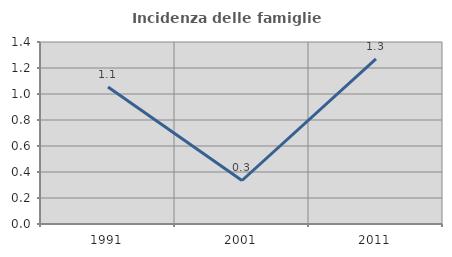
| Category | Incidenza delle famiglie numerose |
|---|---|
| 1991.0 | 1.053 |
| 2001.0 | 0.335 |
| 2011.0 | 1.27 |